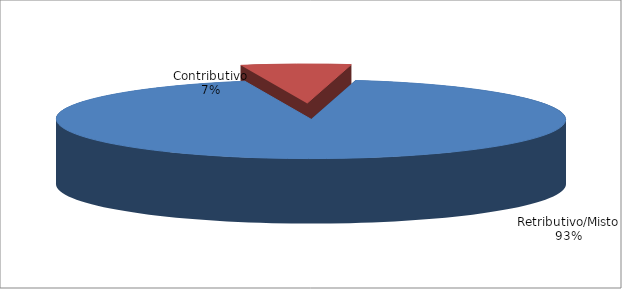
| Category | Series 1 |
|---|---|
| Retributivo/Misto | 209259 |
| Contributivo | 15650 |